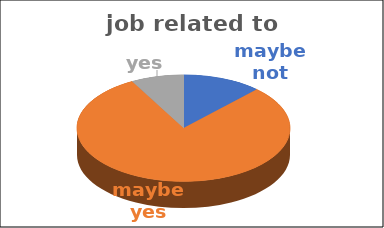
| Category | job related to studies | Series 1 | Series 2 | Series 3 | Series 4 |
|---|---|---|---|---|---|
| maybe not | 0.12 |  |  |  |  |
| maybe yes | 0.8 |  |  |  |  |
| yes | 0.08 |  |  |  |  |